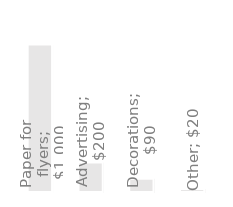
| Category | Yearly Expenses |
|---|---|
| Paper for flyers | 1000 |
| Advertising | 200 |
| Decorations | 90 |
| Other | 20 |